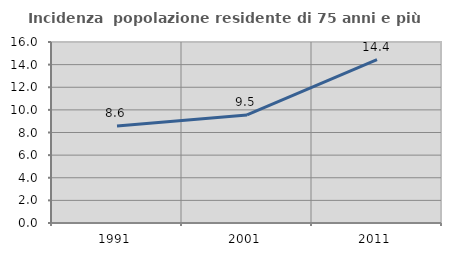
| Category | Incidenza  popolazione residente di 75 anni e più |
|---|---|
| 1991.0 | 8.57 |
| 2001.0 | 9.548 |
| 2011.0 | 14.441 |